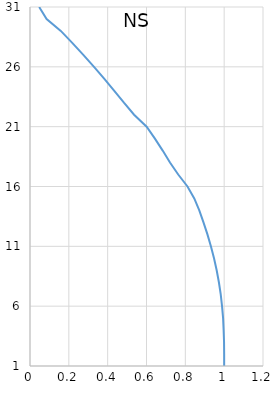
| Category | Series 0 |
|---|---|
| 0.04730206104867898 | 31 |
| 0.08557797191587273 | 30 |
| 0.15863674488515084 | 29 |
| 0.21753942038559654 | 28 |
| 0.27458571905610124 | 27 |
| 0.3297261530240314 | 26 |
| 0.38297177354521345 | 25 |
| 0.4340955266151471 | 24 |
| 0.48374468850441427 | 23 |
| 0.5360372664877615 | 22 |
| 0.6006970245572081 | 21 |
| 0.6433578257363021 | 20 |
| 0.6834090515565289 | 19 |
| 0.7209120687386968 | 18 |
| 0.7632998817292627 | 17 |
| 0.8110887185369016 | 16 |
| 0.8460166807594989 | 15 |
| 0.8718497752490912 | 14 |
| 0.8934472654374127 | 13 |
| 0.913823951197074 | 12 |
| 0.9316571506397804 | 11 |
| 0.947723028362207 | 10 |
| 0.9613920072534647 | 9 |
| 0.9728280500915528 | 8 |
| 0.9821437630678398 | 7 |
| 0.9889903634659691 | 6 |
| 0.9944699582621218 | 5 |
| 0.9972537842209569 | 4 |
| 0.9993795311283596 | 3 |
| 1.0 | 2 |
| 1.0 | 1 |